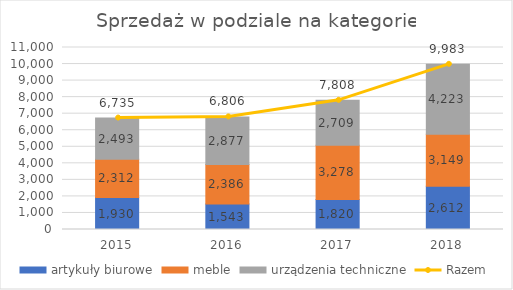
| Category | artykuły biurowe | meble | urządzenia techniczne |
|---|---|---|---|
| 2015.0 | 1929.79 | 2312.448 | 2492.927 |
| 2016.0 | 1542.533 | 2385.765 | 2877.478 |
| 2017.0 | 1820.218 | 3278.109 | 2709.232 |
| 2018.0 | 2611.598 | 3148.861 | 4222.8 |